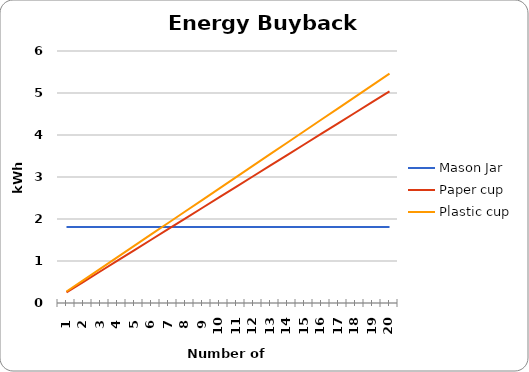
| Category | Mason Jar | Paper cup | Plastic cup |
|---|---|---|---|
| 1.0 | 1.81 | 0.252 | 0.273 |
| 2.0 | 1.81 | 0.504 | 0.546 |
| 3.0 | 1.81 | 0.756 | 0.819 |
| 4.0 | 1.81 | 1.008 | 1.092 |
| 5.0 | 1.81 | 1.26 | 1.365 |
| 6.0 | 1.81 | 1.512 | 1.638 |
| 7.0 | 1.81 | 1.764 | 1.911 |
| 8.0 | 1.81 | 2.016 | 2.184 |
| 9.0 | 1.81 | 2.268 | 2.457 |
| 10.0 | 1.81 | 2.52 | 2.73 |
| 11.0 | 1.81 | 2.772 | 3.003 |
| 12.0 | 1.81 | 3.024 | 3.276 |
| 13.0 | 1.81 | 3.276 | 3.549 |
| 14.0 | 1.81 | 3.528 | 3.822 |
| 15.0 | 1.81 | 3.78 | 4.095 |
| 16.0 | 1.81 | 4.032 | 4.368 |
| 17.0 | 1.81 | 4.284 | 4.641 |
| 18.0 | 1.81 | 4.536 | 4.914 |
| 19.0 | 1.81 | 4.788 | 5.187 |
| 20.0 | 1.81 | 5.04 | 5.46 |